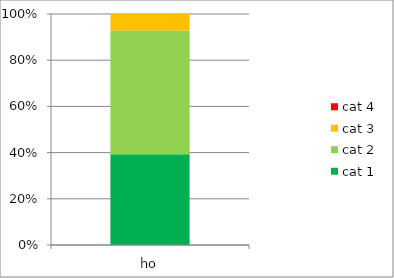
| Category | cat 1 | cat 2 | cat 3 | cat 4 |
|---|---|---|---|---|
| ho | 11 | 15 | 2 | 0 |